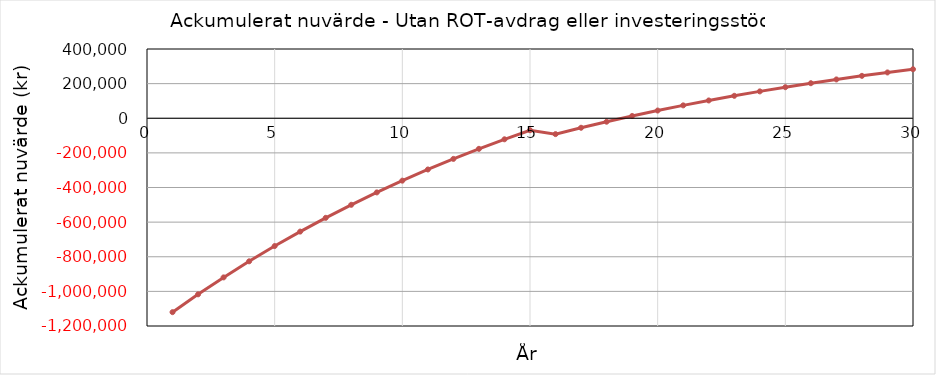
| Category | Ackumulerat |
|---|---|
| 0 | -1120000 |
| 1 | -1016993.595 |
| 2 | -919213.772 |
| 3 | -826395.417 |
| 4 | -738286.861 |
| 5 | -654649.194 |
| 6 | -575255.624 |
| 7 | -499890.86 |
| 8 | -428350.527 |
| 9 | -360440.616 |
| 10 | -295976.956 |
| 11 | -234784.717 |
| 12 | -176697.933 |
| 13 | -121559.059 |
| 14 | -69218.537 |
| 15 | -91686.961 |
| 16 | -54914.72 |
| 17 | -20011.69 |
| 18 | 13117.102 |
| 19 | 44561.807 |
| 20 | 74407.996 |
| 21 | 102736.895 |
| 22 | 129625.603 |
| 23 | 155147.305 |
| 24 | 179371.467 |
| 25 | 202364.026 |
| 26 | 224187.571 |
| 27 | 244901.511 |
| 28 | 264562.238 |
| 29 | 283223.277 |
| 30 | 300935.437 |
| 31 | 0 |
| 32 | 0 |
| 33 | 0 |
| 34 | 0 |
| 35 | 0 |
| 36 | 0 |
| 37 | 0 |
| 38 | 0 |
| 39 | 0 |
| 40 | 0 |
| 41 | 0 |
| 42 | 0 |
| 43 | 0 |
| 44 | 0 |
| 45 | 0 |
| 46 | 0 |
| 47 | 0 |
| 48 | 0 |
| 49 | 0 |
| 50 | 0 |